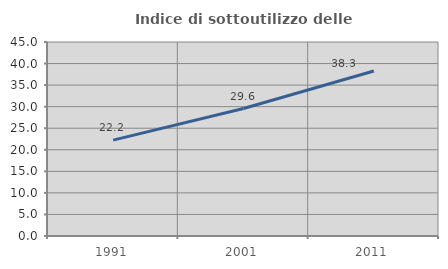
| Category | Indice di sottoutilizzo delle abitazioni  |
|---|---|
| 1991.0 | 22.243 |
| 2001.0 | 29.574 |
| 2011.0 | 38.282 |